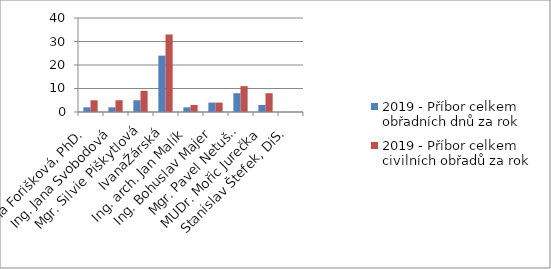
| Category | 2019 - Příbor |
|---|---|
| Ing. Dana Forišková, PhD. | 5 |
| Ing. Jana Svobodová | 5 |
| Mgr. Silvie Piškytlová | 9 |
| IvanaŽárská | 33 |
| Ing. arch. Jan Malík | 3 |
| Ing. Bohuslav Majer | 4 |
| Mgr. Pavel Netušil | 11 |
| MUDr. Mořic Jurečka | 8 |
| Stanislav Štefek, DiS. | 0 |